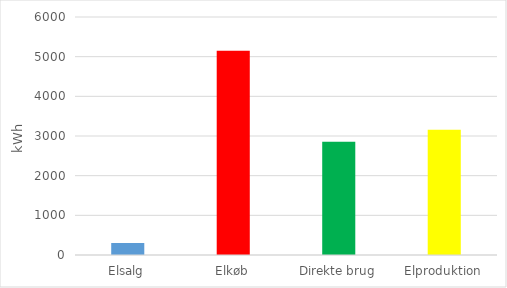
| Category | Series 0 |
|---|---|
| Elsalg | 303.296 |
| Elkøb | 5146.093 |
| Direkte brug | 2853.907 |
| Elproduktion | 3157.204 |